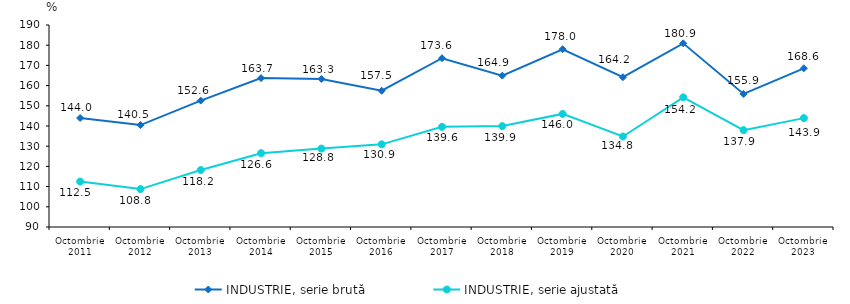
| Category | INDUSTRIE, serie brută | INDUSTRIE, serie ajustată |
|---|---|---|
| Octombrie
2011 | 143.951 | 112.483 |
| Octombrie
2012 | 140.457 | 108.76 |
| Octombrie
2013 | 152.562 | 118.2 |
| Octombrie
2014 | 163.722 | 126.55 |
| Octombrie
2015 | 163.284 | 128.805 |
| Octombrie
2016 | 157.464 | 130.917 |
| Octombrie
2017 | 173.563 | 139.571 |
| Octombrie
2018 | 164.925 | 139.949 |
| Octombrie
2019 | 178.006 | 145.986 |
| Octombrie
2020 | 164.159 | 134.8 |
| Octombrie
2021 | 180.916 | 154.184 |
| Octombrie
2022 | 155.885 | 137.942 |
| Octombrie
2023 | 168.561 | 143.907 |